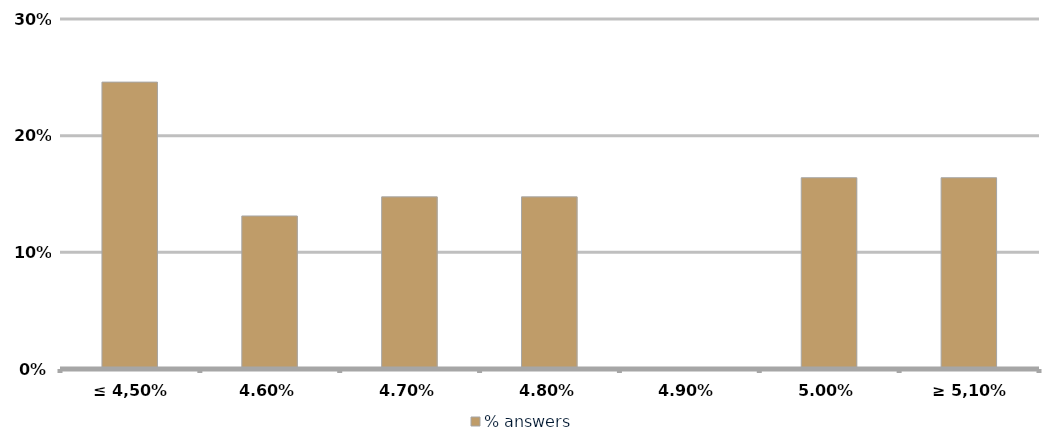
| Category | % answers |
|---|---|
| ≤ 4,50% | 0.246 |
| 4,60% | 0.131 |
| 4,70% | 0.148 |
| 4,80% | 0.148 |
| 4,90% | 0 |
| 5,00% | 0.164 |
| ≥ 5,10% | 0.164 |